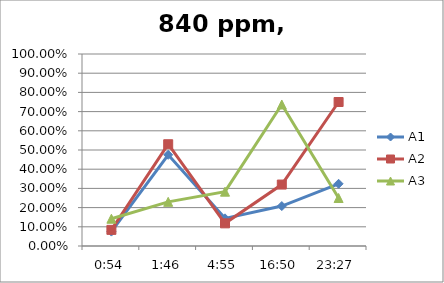
| Category | A1 | A2 | A3 |
|---|---|---|---|
| 0.0375 | 0.075 | 0.084 | 0.142 |
| 0.0736111111111111 | 0.475 | 0.53 | 0.23 |
| 0.204861111111111 | 0.144 | 0.118 | 0.283 |
| 1900-01-23 16:50:00 | 0.208 | 0.32 | 0.737 |
| 1900-01-23 23:27:00 | 0.324 | 0.75 | 0.25 |